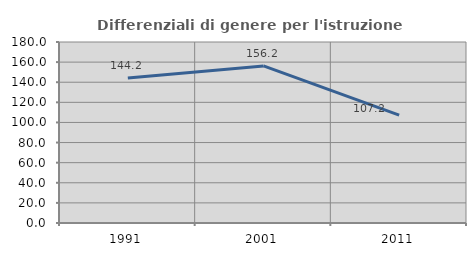
| Category | Differenziali di genere per l'istruzione superiore |
|---|---|
| 1991.0 | 144.161 |
| 2001.0 | 156.203 |
| 2011.0 | 107.208 |